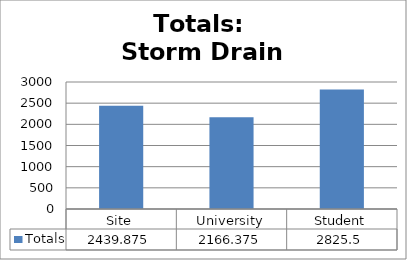
| Category | Totals |
|---|---|
| Site | 2439.875 |
| University | 2166.375 |
| Student | 2825.5 |